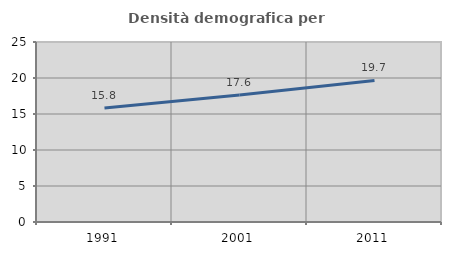
| Category | Densità demografica |
|---|---|
| 1991.0 | 15.822 |
| 2001.0 | 17.644 |
| 2011.0 | 19.658 |